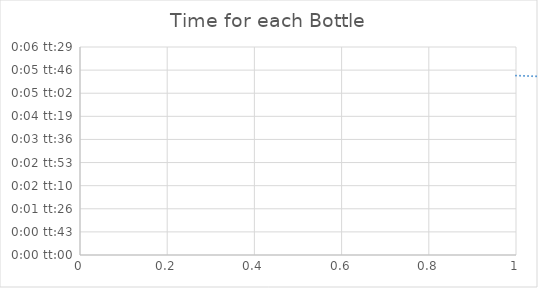
| Category | Time for each Bottle |
|---|---|
| 0 | 0.004 |
| 1 | 0.003 |
| 2 | 0.003 |
| 3 | 0.002 |
| 4 | 0.003 |